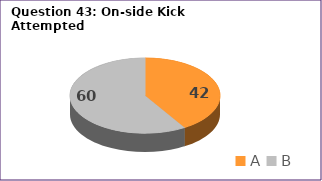
| Category | Series 0 |
|---|---|
| A | 42 |
| B | 60 |